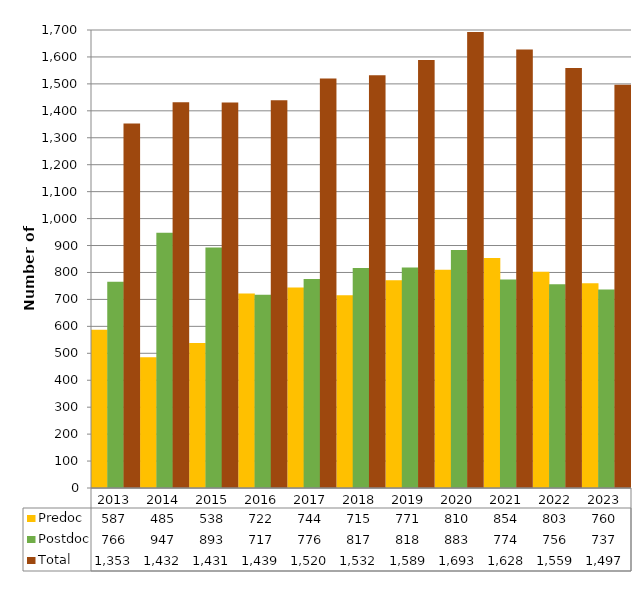
| Category | Predoc | Postdoc | Total |
|---|---|---|---|
| 2013.0 | 587 | 766 | 1353 |
| 2014.0 | 485 | 947 | 1432 |
| 2015.0 | 538 | 893 | 1431 |
| 2016.0 | 722 | 717 | 1439 |
| 2017.0 | 744 | 776 | 1520 |
| 2018.0 | 715 | 817 | 1532 |
| 2019.0 | 771 | 818 | 1589 |
| 2020.0 | 810 | 883 | 1693 |
| 2021.0 | 854 | 774 | 1628 |
| 2022.0 | 803 | 756 | 1559 |
| 2023.0 | 760 | 737 | 1497 |